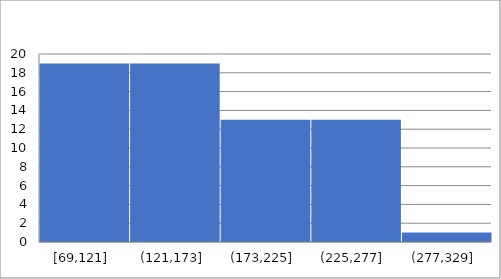
| Category | Series 0 |
|---|---|
| 0 | 78 |
| 1 | 185 |
| 2 | 123 |
| 3 | 215 |
| 4 | 107 |
| 5 | 188 |
| 6 | 253 |
| 7 | 176 |
| 8 | 146 |
| 9 | 138 |
| 10 | 183 |
| 11 | 246 |
| 12 | 87 |
| 13 | 158 |
| 14 | 204 |
| 15 | 259 |
| 16 | 87 |
| 17 | 141 |
| 18 | 229 |
| 19 | 250 |
| 20 | 241 |
| 21 | 300 |
| 22 | 253 |
| 23 | 268 |
| 24 | 160 |
| 25 | 148 |
| 26 | 121 |
| 27 | 158 |
| 28 | 107 |
| 29 | 126 |
| 30 | 132 |
| 31 | 130 |
| 32 | 108 |
| 33 | 120 |
| 34 | 139 |
| 35 | 105 |
| 36 | 100 |
| 37 | 176 |
| 38 | 183 |
| 39 | 219 |
| 40 | 133 |
| 41 | 106 |
| 42 | 166 |
| 43 | 247 |
| 44 | 202 |
| 45 | 227 |
| 46 | 252 |
| 47 | 256 |
| 48 | 118 |
| 49 | 71 |
| 50 | 143 |
| 51 | 125 |
| 52 | 152 |
| 53 | 174 |
| 54 | 183 |
| 55 | 220 |
| 56 | 94 |
| 57 | 75 |
| 58 | 121 |
| 59 | 227 |
| 60 | 85 |
| 61 | 105 |
| 62 | 144 |
| 63 | 142 |
| 64 | 69 |